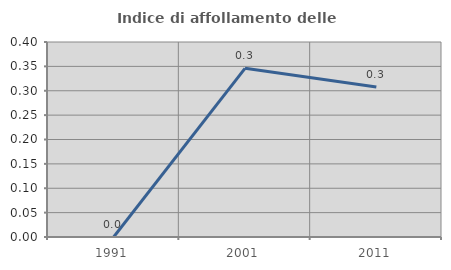
| Category | Indice di affollamento delle abitazioni  |
|---|---|
| 1991.0 | 0 |
| 2001.0 | 0.346 |
| 2011.0 | 0.308 |